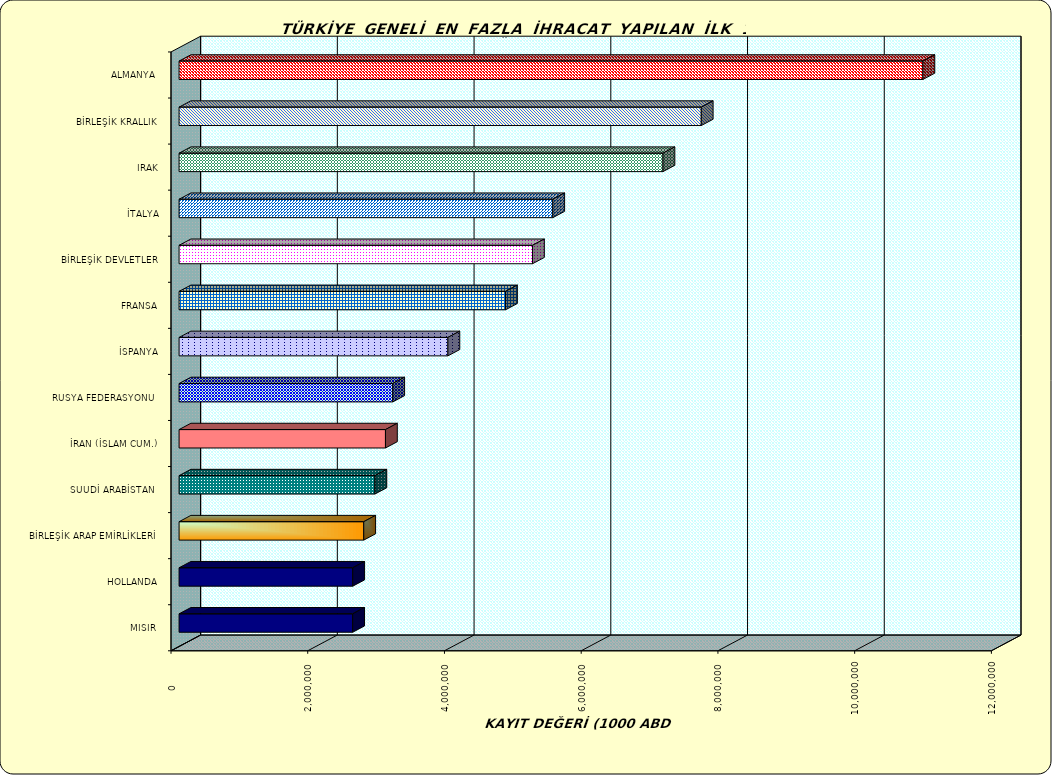
| Category | Series 0 |
|---|---|
| ALMANYA  | 10880299.541 |
| BİRLEŞİK KRALLIK | 7638133.625 |
| IRAK | 7078034.031 |
| İTALYA | 5465892.929 |
| BİRLEŞİK DEVLETLER | 5169859.737 |
| FRANSA | 4775033.735 |
| İSPANYA | 3932346.866 |
| RUSYA FEDERASYONU  | 3125216.992 |
| İRAN (İSLAM CUM.) | 3018811.175 |
| SUUDİ ARABİSTAN  | 2864336.47 |
| BİRLEŞİK ARAP EMİRLİKLERİ | 2701089.878 |
| HOLLANDA | 2539942.292 |
| MISIR  | 2539354.196 |